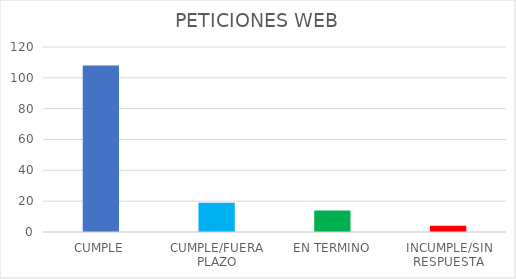
| Category | TOTAL |
|---|---|
| CUMPLE | 108 |
| CUMPLE/FUERA PLAZO | 19 |
| EN TERMINO | 14 |
| INCUMPLE/SIN RESPUESTA | 4 |